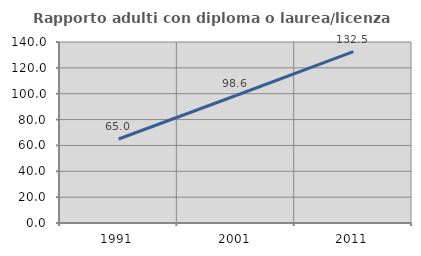
| Category | Rapporto adulti con diploma o laurea/licenza media  |
|---|---|
| 1991.0 | 64.989 |
| 2001.0 | 98.601 |
| 2011.0 | 132.513 |